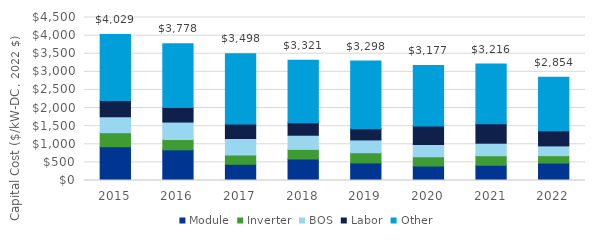
| Category | Module | Inverter | BOS | Labor | Other |
|---|---|---|---|---|---|
| 2015.0 | 931.713 | 387.842 | 440.141 | 449.902 | 1819.84 |
| 2016.0 | 846.78 | 283.984 | 482.711 | 400.305 | 1764.124 |
| 2017.0 | 451.615 | 249.643 | 461.256 | 399.46 | 1935.882 |
| 2018.0 | 593.317 | 265.099 | 391.337 | 347.134 | 1724.504 |
| 2019.0 | 484.36 | 282.203 | 353.269 | 309.042 | 1869.059 |
| 2020.0 | 398.045 | 258.432 | 339.066 | 505.662 | 1675.452 |
| 2021.0 | 421.468 | 262.391 | 345.845 | 534.595 | 1651.591 |
| 2022.0 | 481.735 | 204.296 | 269.701 | 415.833 | 1482.181 |